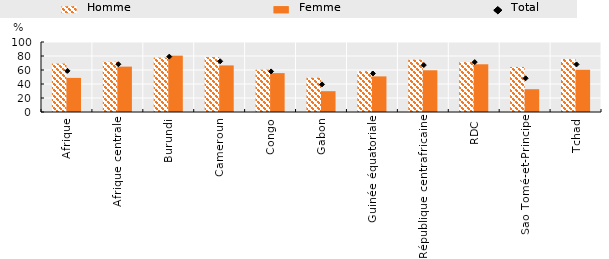
| Category | Homme | Femme |
|---|---|---|
| Afrique | 69.128 | 48.737 |
| Afrique centrale | 71.713 | 64.825 |
| Burundi | 77.655 | 80.496 |
| Cameroun | 78.402 | 66.551 |
| Congo | 60.449 | 55.542 |
| Gabon | 48.998 | 29.706 |
| Guinée équatoriale | 58.338 | 50.868 |
| République centrafricaine | 74.758 | 59.631 |
| RDC | 71.304 | 68.156 |
| Sao Tomé-et-Principe | 64.331 | 32.557 |
| Tchad | 75.734 | 60.36 |